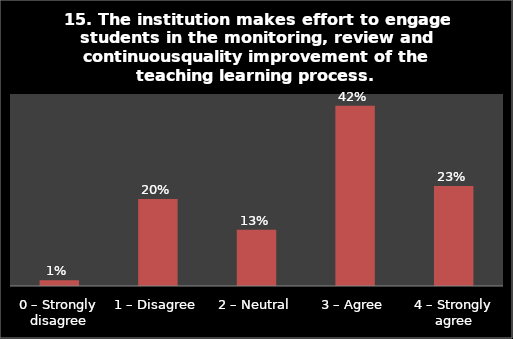
| Category | Series 0 |
|---|---|
| 0 – Strongly disagree | 0.013 |
| 1 – Disagree | 0.204 |
| 2 – Neutral | 0.132 |
| 3 – Agree | 0.422 |
| 4 – Strongly agree | 0.234 |